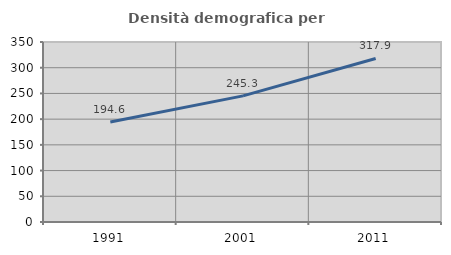
| Category | Densità demografica |
|---|---|
| 1991.0 | 194.606 |
| 2001.0 | 245.266 |
| 2011.0 | 317.937 |